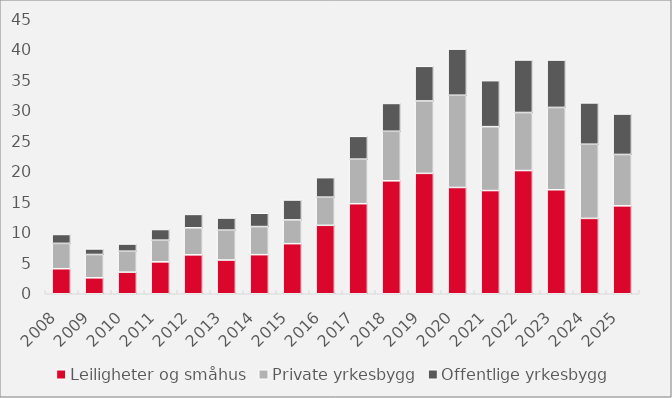
| Category | Leiligheter og småhus | Private yrkesbygg | Offentlige yrkesbygg |
|---|---|---|---|
| 2008.0 | 4.097 | 4.144 | 1.459 |
| 2009.0 | 2.612 | 3.815 | 0.906 |
| 2010.0 | 3.532 | 3.431 | 1.177 |
| 2011.0 | 5.222 | 3.547 | 1.743 |
| 2012.0 | 6.371 | 4.417 | 2.193 |
| 2013.0 | 5.524 | 4.889 | 1.981 |
| 2014.0 | 6.398 | 4.598 | 2.176 |
| 2015.0 | 8.199 | 3.884 | 3.262 |
| 2016.0 | 11.197 | 4.607 | 3.197 |
| 2017.0 | 14.739 | 7.29 | 3.728 |
| 2018.0 | 18.482 | 8.104 | 4.556 |
| 2019.0 | 19.701 | 11.844 | 5.668 |
| 2020.0 | 17.391 | 15.094 | 7.548 |
| 2021.0 | 16.888 | 10.456 | 7.527 |
| 2022.0 | 20.162 | 9.498 | 8.597 |
| 2023.0 | 17.02 | 13.47 | 7.753 |
| 2024.0 | 12.332 | 12.136 | 6.758 |
| 2025.0 | 14.386 | 8.407 | 6.62 |